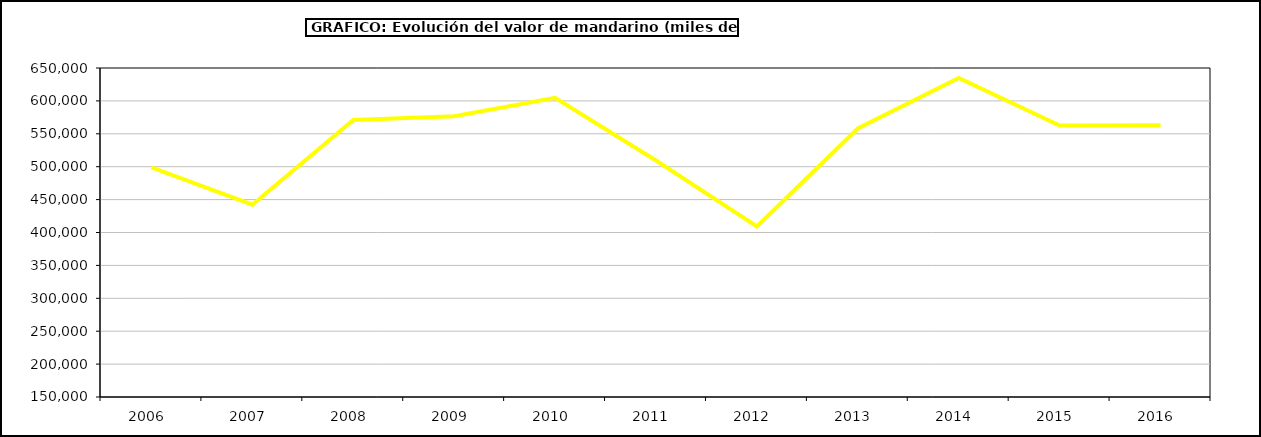
| Category | Valor |
|---|---|
| 2006.0 | 498850.946 |
| 2007.0 | 442203.62 |
| 2008.0 | 571014.871 |
| 2009.0 | 576642.957 |
| 2010.0 | 604584.128 |
| 2011.0 | 509378.831 |
| 2012.0 | 409245.656 |
| 2013.0 | 558087.419 |
| 2014.0 | 634994.836 |
| 2015.0 | 562627 |
| 2016.0 | 563122 |